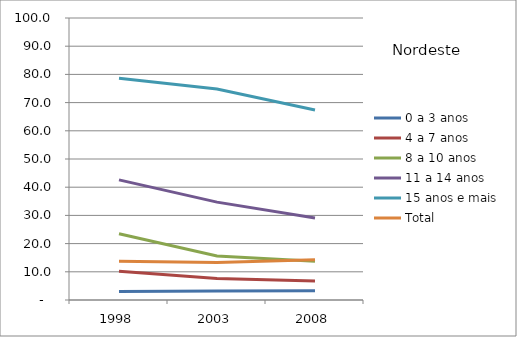
| Category | 0 a 3 anos | 4 a 7 anos | 8 a 10 anos | 11 a 14 anos | 15 anos e mais | Total |
|---|---|---|---|---|---|---|
| 1998.0 | 3 | 10.2 | 23.5 | 42.6 | 78.6 | 13.7 |
| 2003.0 | 3.2 | 7.6 | 15.6 | 34.7 | 74.8 | 13.3 |
| 2008.0 | 3.3 | 6.7 | 13.7 | 29.1 | 67.4 | 14.3 |